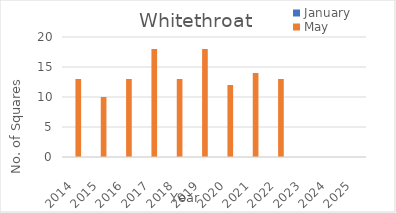
| Category | January | May |
|---|---|---|
| 2014.0 | 0 | 13 |
| 2015.0 | 0 | 10 |
| 2016.0 | 0 | 13 |
| 2017.0 | 0 | 18 |
| 2018.0 | 0 | 13 |
| 2019.0 | 0 | 18 |
| 2020.0 | 0 | 12 |
| 2021.0 | 0 | 14 |
| 2022.0 | 0 | 13 |
| 2023.0 | 0 | 0 |
| 2024.0 | 0 | 0 |
| 2025.0 | 0 | 0 |